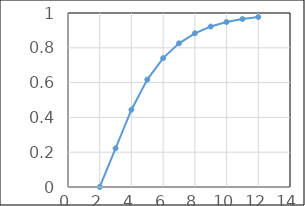
| Category | Series 0 |
|---|---|
| 2.0 | 0 |
| 3.0 | 0.222 |
| 4.0 | 0.444 |
| 5.0 | 0.617 |
| 6.0 | 0.741 |
| 7.0 | 0.826 |
| 8.0 | 0.883 |
| 9.0 | 0.922 |
| 10.0 | 0.948 |
| 11.0 | 0.965 |
| 12.0 | 0.977 |